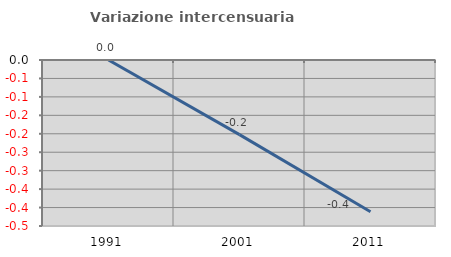
| Category | Variazione intercensuaria annua |
|---|---|
| 1991.0 | 0 |
| 2001.0 | -0.202 |
| 2011.0 | -0.411 |